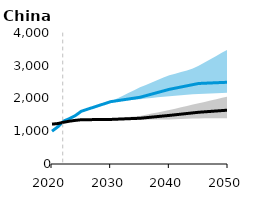
| Category | CHI ZCT Ref | CHI FOS Ref |
|---|---|---|
| 2020.0 | 1001.697 | 1216.814 |
| 2021.0 | 1135.724 | 1235.151 |
| 2022.0 | 1312.514 | 1274.851 |
| 2023.0 | 1387.605 | 1308.496 |
| 2024.0 | 1480.578 | 1332.656 |
| 2025.0 | 1611.159 | 1351.405 |
| 2026.0 | 1669.542 | 1353.333 |
| 2027.0 | 1727.926 | 1355.261 |
| 2028.0 | 1786.309 | 1357.189 |
| 2029.0 | 1844.692 | 1359.116 |
| 2030.0 | 1903.076 | 1361.044 |
| 2031.0 | 1929.942 | 1368.18 |
| 2032.0 | 1956.808 | 1375.315 |
| 2033.0 | 1983.674 | 1382.45 |
| 2034.0 | 2010.541 | 1389.585 |
| 2035.0 | 2037.407 | 1396.721 |
| 2036.0 | 2085.978 | 1414.082 |
| 2037.0 | 2134.548 | 1431.444 |
| 2038.0 | 2183.119 | 1448.805 |
| 2039.0 | 2231.69 | 1466.167 |
| 2040.0 | 2280.261 | 1483.528 |
| 2041.0 | 2315.975 | 1502.808 |
| 2042.0 | 2351.69 | 1522.088 |
| 2043.0 | 2387.404 | 1541.367 |
| 2044.0 | 2423.118 | 1560.647 |
| 2045.0 | 2458.833 | 1579.926 |
| 2046.0 | 2466.385 | 1592.879 |
| 2047.0 | 2473.937 | 1605.832 |
| 2048.0 | 2481.489 | 1618.785 |
| 2049.0 | 2489.041 | 1631.738 |
| 2050.0 | 2496.593 | 1644.69 |